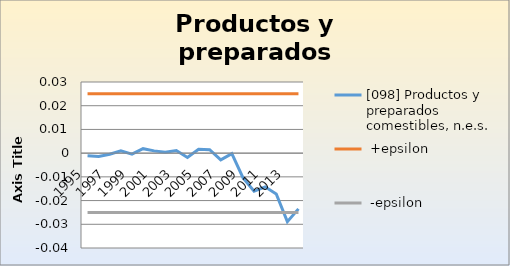
| Category | [098] Productos y preparados comestibles, n.e.s. |  +epsilon |  -epsilon |
|---|---|---|---|
| 1995.0 | -0.001 | 0.025 | -0.025 |
| 1996.0 | -0.001 | 0.025 | -0.025 |
| 1997.0 | 0 | 0.025 | -0.025 |
| 1998.0 | 0.001 | 0.025 | -0.025 |
| 1999.0 | 0 | 0.025 | -0.025 |
| 2000.0 | 0.002 | 0.025 | -0.025 |
| 2001.0 | 0.001 | 0.025 | -0.025 |
| 2002.0 | 0 | 0.025 | -0.025 |
| 2003.0 | 0.001 | 0.025 | -0.025 |
| 2004.0 | -0.002 | 0.025 | -0.025 |
| 2005.0 | 0.002 | 0.025 | -0.025 |
| 2006.0 | 0.001 | 0.025 | -0.025 |
| 2007.0 | -0.003 | 0.025 | -0.025 |
| 2008.0 | 0 | 0.025 | -0.025 |
| 2009.0 | -0.01 | 0.025 | -0.025 |
| 2010.0 | -0.016 | 0.025 | -0.025 |
| 2011.0 | -0.014 | 0.025 | -0.025 |
| 2012.0 | -0.017 | 0.025 | -0.025 |
| 2013.0 | -0.029 | 0.025 | -0.025 |
| 2014.0 | -0.024 | 0.025 | -0.025 |